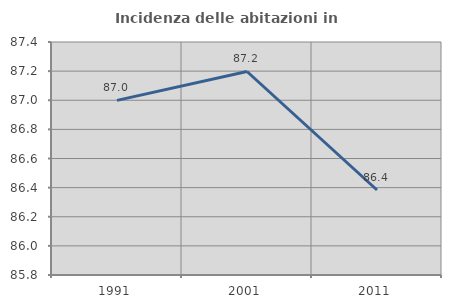
| Category | Incidenza delle abitazioni in proprietà  |
|---|---|
| 1991.0 | 86.999 |
| 2001.0 | 87.198 |
| 2011.0 | 86.384 |